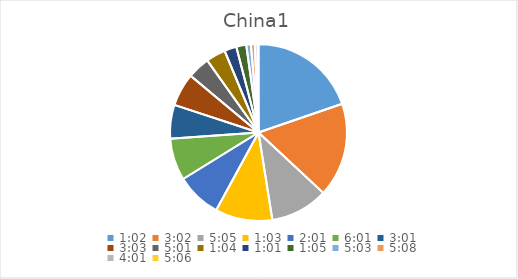
| Category | Series 0 |
|---|---|
| 0.04305555555555556 | 22.216 |
| 0.12638888888888888 | 19.353 |
| 0.21180555555555555 | 11.866 |
| 0.043750000000000004 | 11.749 |
| 0.08402777777777777 | 9.295 |
| 0.25069444444444444 | 8.629 |
| 0.12569444444444444 | 6.947 |
| 0.12708333333333333 | 6.786 |
| 0.20902777777777778 | 4.594 |
| 0.044444444444444446 | 4.035 |
| 0.042361111111111106 | 2.49 |
| 0.04513888888888889 | 2.051 |
| 0.21041666666666667 | 0.943 |
| 0.2138888888888889 | 0.801 |
| 0.1673611111111111 | 0.564 |
| 0.2125 | 0.187 |